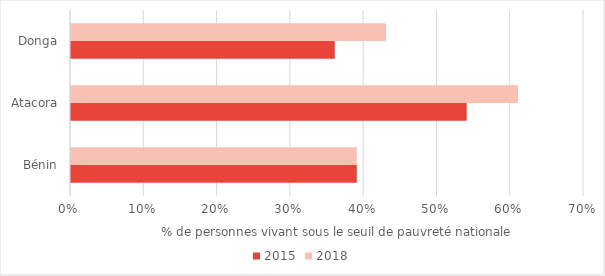
| Category | 2015 | 2018 |
|---|---|---|
| Bénin | 0.39 | 0.39 |
| Atacora | 0.54 | 0.61 |
| Donga | 0.36 | 0.43 |